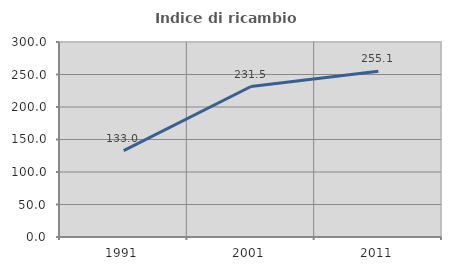
| Category | Indice di ricambio occupazionale  |
|---|---|
| 1991.0 | 132.976 |
| 2001.0 | 231.529 |
| 2011.0 | 255.145 |